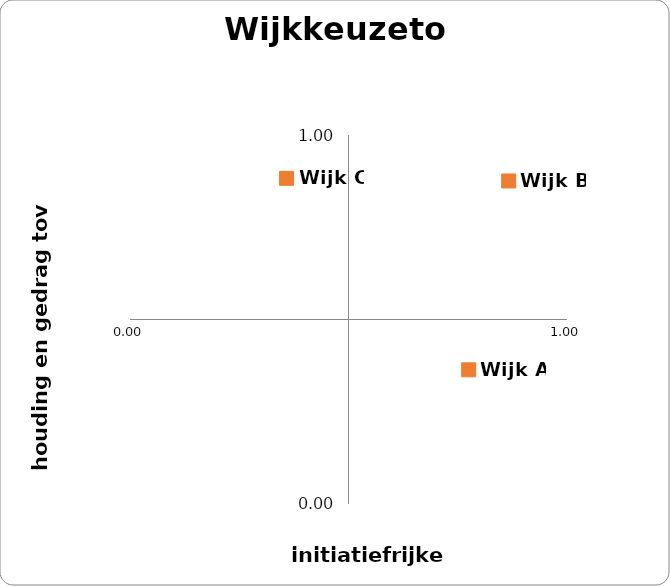
| Category | Wijken |
|---|---|
| 0.7750000000000001 | 0.364 |
| 0.8666666666666666 | 0.875 |
| 0.35833333333333334 | 0.883 |